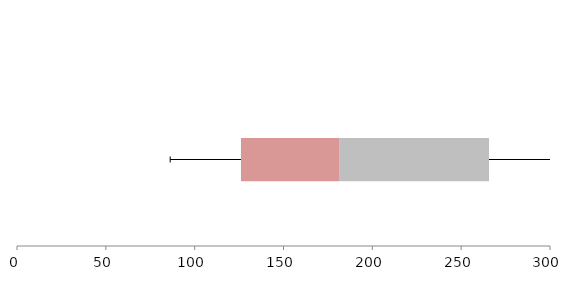
| Category | Series 1 | Series 2 | Series 3 |
|---|---|---|---|
| 0 | 126.063 | 55.219 | 84.392 |